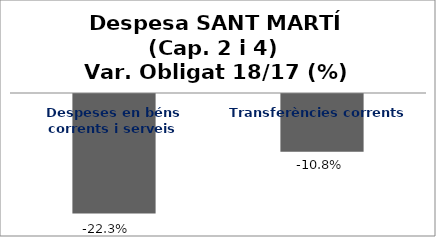
| Category | Series 0 |
|---|---|
| Despeses en béns corrents i serveis | -0.223 |
| Transferències corrents | -0.108 |